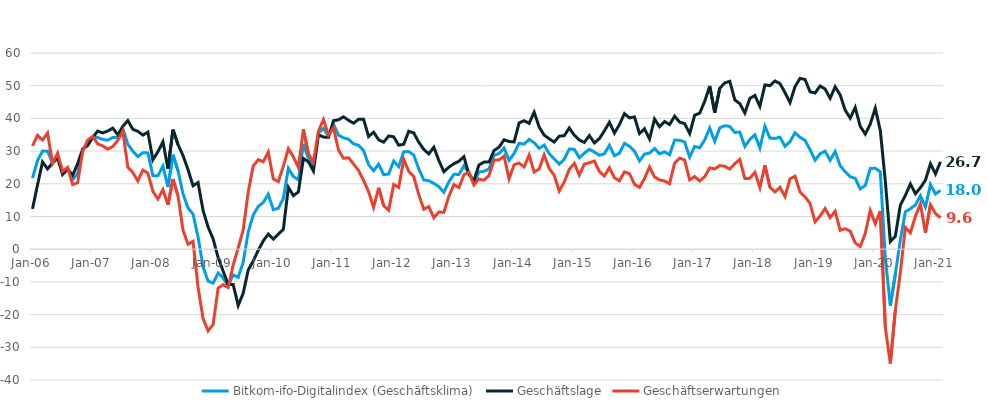
| Category | Bitkom-ifo-Digitalindex (Geschäftsklima) | Geschäftslage | Geschäftserwartungen |
|---|---|---|---|
| 2006-01-01 | 21.74 | 12.33 | 31.57 |
| 2006-02-01 | 27.12 | 19.67 | 34.82 |
| 2006-03-01 | 30 | 26.68 | 33.37 |
| 2006-04-01 | 29.98 | 24.57 | 35.52 |
| 2006-05-01 | 26.35 | 26.4 | 26.29 |
| 2006-06-01 | 28.6 | 27.87 | 29.34 |
| 2006-07-01 | 23.33 | 22.85 | 23.81 |
| 2006-08-01 | 24.76 | 24.51 | 25 |
| 2006-09-01 | 21.18 | 22.6 | 19.77 |
| 2006-10-01 | 23.22 | 26.14 | 20.33 |
| 2006-11-01 | 30.27 | 30.61 | 29.92 |
| 2006-12-01 | 32.53 | 31.71 | 33.36 |
| 2007-01-01 | 34.36 | 34.23 | 34.49 |
| 2007-02-01 | 34.15 | 36.12 | 32.2 |
| 2007-03-01 | 33.58 | 35.57 | 31.6 |
| 2007-04-01 | 33.35 | 36.14 | 30.6 |
| 2007-05-01 | 34.18 | 37.02 | 31.38 |
| 2007-06-01 | 34.13 | 34.99 | 33.28 |
| 2007-07-01 | 36.87 | 37.55 | 36.18 |
| 2007-08-01 | 32.11 | 39.33 | 25.1 |
| 2007-09-01 | 29.97 | 36.67 | 23.46 |
| 2007-10-01 | 28.32 | 36.04 | 20.86 |
| 2007-11-01 | 29.48 | 34.89 | 24.2 |
| 2007-12-01 | 29.45 | 35.8 | 23.26 |
| 2008-01-01 | 22.46 | 27.33 | 17.7 |
| 2008-02-01 | 22.45 | 29.81 | 15.32 |
| 2008-03-01 | 25.42 | 32.88 | 18.2 |
| 2008-04-01 | 19.02 | 24.63 | 13.56 |
| 2008-05-01 | 28.88 | 36.56 | 21.44 |
| 2008-06-01 | 24.05 | 32.01 | 16.37 |
| 2008-07-01 | 16.94 | 28.66 | 5.82 |
| 2008-08-01 | 12.61 | 24.31 | 1.51 |
| 2008-09-01 | 10.74 | 19.41 | 2.4 |
| 2008-10-01 | 3.73 | 20.38 | -11.66 |
| 2008-11-01 | -5.38 | 11.85 | -21.2 |
| 2008-12-01 | -9.76 | 6.79 | -24.99 |
| 2009-01-01 | -10.4 | 3.17 | -23.06 |
| 2009-02-01 | -7.28 | -2.54 | -11.92 |
| 2009-03-01 | -8.79 | -6.7 | -10.85 |
| 2009-04-01 | -11.25 | -10.77 | -11.73 |
| 2009-05-01 | -7.85 | -10.78 | -4.87 |
| 2009-06-01 | -8.63 | -17.22 | 0.36 |
| 2009-07-01 | -4.03 | -13.48 | 5.9 |
| 2009-08-01 | 5.24 | -6.35 | 17.53 |
| 2009-09-01 | 10.42 | -3.6 | 25.44 |
| 2009-10-01 | 13.07 | -0.34 | 27.37 |
| 2009-11-01 | 14.3 | 2.54 | 26.74 |
| 2009-12-01 | 16.8 | 4.63 | 29.7 |
| 2010-01-01 | 12.09 | 3.08 | 21.5 |
| 2010-02-01 | 12.49 | 4.62 | 20.66 |
| 2010-03-01 | 15.47 | 6.03 | 25.34 |
| 2010-04-01 | 24.76 | 18.92 | 30.75 |
| 2010-05-01 | 22.23 | 16.38 | 28.24 |
| 2010-06-01 | 21.21 | 17.53 | 24.96 |
| 2010-07-01 | 32.14 | 27.75 | 36.62 |
| 2010-08-01 | 27.97 | 26.75 | 29.2 |
| 2010-09-01 | 25.28 | 23.92 | 26.65 |
| 2010-10-01 | 35.53 | 35.03 | 36.04 |
| 2010-11-01 | 36.94 | 34.29 | 39.63 |
| 2010-12-01 | 34.54 | 34.21 | 34.87 |
| 2011-01-01 | 38.22 | 39.29 | 37.16 |
| 2011-02-01 | 34.88 | 39.57 | 30.29 |
| 2011-03-01 | 34.06 | 40.49 | 27.8 |
| 2011-04-01 | 33.63 | 39.42 | 27.98 |
| 2011-05-01 | 32.21 | 38.53 | 26.06 |
| 2011-06-01 | 31.77 | 39.73 | 24.07 |
| 2011-07-01 | 30.17 | 39.71 | 21 |
| 2011-08-01 | 25.84 | 34.45 | 17.55 |
| 2011-09-01 | 23.99 | 35.79 | 12.77 |
| 2011-10-01 | 26.01 | 33.46 | 18.79 |
| 2011-11-01 | 22.8 | 32.73 | 13.31 |
| 2011-12-01 | 22.98 | 34.63 | 11.9 |
| 2012-01-01 | 26.96 | 34.36 | 19.79 |
| 2012-02-01 | 25.24 | 31.8 | 18.87 |
| 2012-03-01 | 29.8 | 32.1 | 27.51 |
| 2012-04-01 | 29.85 | 36.07 | 23.81 |
| 2012-05-01 | 28.77 | 35.54 | 22.19 |
| 2012-06-01 | 24.56 | 32.71 | 16.7 |
| 2012-07-01 | 21.18 | 30.52 | 12.22 |
| 2012-08-01 | 20.94 | 29.15 | 13.03 |
| 2012-09-01 | 20.12 | 31.19 | 9.58 |
| 2012-10-01 | 19.12 | 27.16 | 11.38 |
| 2012-11-01 | 17.4 | 23.69 | 11.28 |
| 2012-12-01 | 20.6 | 25.1 | 16.18 |
| 2013-01-01 | 22.92 | 26.12 | 19.77 |
| 2013-02-01 | 22.83 | 26.9 | 18.83 |
| 2013-03-01 | 25.51 | 28.31 | 22.75 |
| 2013-04-01 | 23.19 | 22.79 | 23.6 |
| 2013-05-01 | 20.31 | 21.01 | 19.62 |
| 2013-06-01 | 23.59 | 25.77 | 21.43 |
| 2013-07-01 | 23.85 | 26.63 | 21.1 |
| 2013-08-01 | 24.57 | 26.63 | 22.54 |
| 2013-09-01 | 28.7 | 30.16 | 27.24 |
| 2013-10-01 | 29.26 | 31.22 | 27.3 |
| 2013-11-01 | 30.95 | 33.44 | 28.49 |
| 2013-12-01 | 27.14 | 32.93 | 21.49 |
| 2014-01-01 | 29.28 | 32.8 | 25.82 |
| 2014-02-01 | 32.39 | 38.61 | 26.33 |
| 2014-03-01 | 32.14 | 39.3 | 25.19 |
| 2014-04-01 | 33.58 | 38.49 | 28.78 |
| 2014-05-01 | 32.56 | 41.9 | 23.58 |
| 2014-06-01 | 30.85 | 37.36 | 24.53 |
| 2014-07-01 | 31.83 | 34.87 | 28.82 |
| 2014-08-01 | 29.18 | 33.78 | 24.67 |
| 2014-09-01 | 27.62 | 32.76 | 22.59 |
| 2014-10-01 | 26.02 | 34.57 | 17.78 |
| 2014-11-01 | 27.51 | 34.7 | 20.55 |
| 2014-12-01 | 30.65 | 37.07 | 24.41 |
| 2015-01-01 | 30.53 | 34.87 | 26.27 |
| 2015-02-01 | 27.97 | 33.39 | 22.69 |
| 2015-03-01 | 29.32 | 32.66 | 26.03 |
| 2015-04-01 | 30.55 | 34.74 | 26.43 |
| 2015-05-01 | 29.71 | 32.51 | 26.96 |
| 2015-06-01 | 28.73 | 33.81 | 23.76 |
| 2015-07-01 | 29.17 | 36.2 | 22.36 |
| 2015-08-01 | 31.77 | 38.82 | 24.93 |
| 2015-09-01 | 28.57 | 35.51 | 21.84 |
| 2015-10-01 | 29.34 | 38.1 | 20.9 |
| 2015-11-01 | 32.37 | 41.46 | 23.63 |
| 2015-12-01 | 31.46 | 40.15 | 23.09 |
| 2016-01-01 | 29.93 | 40.45 | 19.88 |
| 2016-02-01 | 26.99 | 35.36 | 18.91 |
| 2016-03-01 | 29.08 | 36.83 | 21.58 |
| 2016-04-01 | 29.39 | 33.7 | 25.16 |
| 2016-05-01 | 30.79 | 39.81 | 22.11 |
| 2016-06-01 | 29.17 | 37.44 | 21.19 |
| 2016-07-01 | 29.76 | 39.04 | 20.84 |
| 2016-08-01 | 28.89 | 38.12 | 20.02 |
| 2016-09-01 | 33.39 | 40.69 | 26.32 |
| 2016-10-01 | 33.3 | 38.86 | 27.86 |
| 2016-11-01 | 32.77 | 38.41 | 27.25 |
| 2016-12-01 | 28.18 | 35.37 | 21.22 |
| 2017-01-01 | 31.41 | 40.98 | 22.22 |
| 2017-02-01 | 31.01 | 41.6 | 20.88 |
| 2017-03-01 | 33.42 | 45.24 | 22.16 |
| 2017-04-01 | 37.06 | 49.91 | 24.87 |
| 2017-05-01 | 32.99 | 41.76 | 24.54 |
| 2017-06-01 | 37.08 | 49.2 | 25.55 |
| 2017-07-01 | 37.76 | 50.87 | 25.34 |
| 2017-08-01 | 37.54 | 51.33 | 24.5 |
| 2017-09-01 | 35.7 | 45.65 | 26.15 |
| 2017-10-01 | 35.82 | 44.51 | 27.44 |
| 2017-11-01 | 31.42 | 41.65 | 21.62 |
| 2017-12-01 | 33.57 | 46.11 | 21.67 |
| 2018-01-01 | 34.99 | 47.04 | 23.52 |
| 2018-02-01 | 30.93 | 43.69 | 18.83 |
| 2018-03-01 | 37.63 | 50.24 | 25.65 |
| 2018-04-01 | 33.98 | 50 | 18.98 |
| 2018-05-01 | 33.86 | 51.45 | 17.51 |
| 2018-06-01 | 34.25 | 50.64 | 18.93 |
| 2018-07-01 | 31.46 | 47.91 | 16.1 |
| 2018-08-01 | 32.88 | 44.83 | 21.52 |
| 2018-09-01 | 35.61 | 49.71 | 22.31 |
| 2018-10-01 | 34.23 | 52.24 | 17.5 |
| 2018-11-01 | 33.26 | 51.9 | 15.99 |
| 2018-12-01 | 30.44 | 48.14 | 14 |
| 2019-01-01 | 27.22 | 47.77 | 8.37 |
| 2019-02-01 | 29.16 | 49.91 | 10.13 |
| 2019-03-01 | 29.98 | 48.99 | 12.43 |
| 2019-04-01 | 27.18 | 46.15 | 9.67 |
| 2019-05-01 | 29.85 | 49.66 | 11.61 |
| 2019-06-01 | 25.54 | 47.18 | 5.79 |
| 2019-07-01 | 23.67 | 42.54 | 6.26 |
| 2019-08-01 | 22.14 | 40.08 | 5.54 |
| 2019-09-01 | 21.68 | 43.35 | 1.94 |
| 2019-10-01 | 18.43 | 37.57 | 0.83 |
| 2019-11-01 | 19.48 | 35.21 | 4.8 |
| 2019-12-01 | 24.68 | 38.27 | 11.86 |
| 2020-01-01 | 24.75 | 43.1 | 7.79 |
| 2020-02-01 | 23.66 | 36.3 | 11.69 |
| 2020-03-01 | -2.75 | 20.87 | -23.83 |
| 2020-04-01 | -17.29 | 2.33 | -35 |
| 2020-05-01 | -7.67 | 3.96 | -18.64 |
| 2020-06-01 | 2.92 | 13.48 | -7.12 |
| 2020-07-01 | 11.49 | 16.45 | 6.65 |
| 2020-08-01 | 12.37 | 19.97 | 5.03 |
| 2020-09-01 | 13.5 | 16.99 | 10.07 |
| 2020-10-01 | 16.3 | 18.82 | 13.82 |
| 2020-11-01 | 12.9 | 21.1 | 5.01 |
| 2020-12-01 | 19.77 | 26.15 | 13.58 |
| 2021-01-01 | 16.88 | 23.02 | 10.9 |
| 2021-02-01 | 18 | 26.72 | 9.62 |